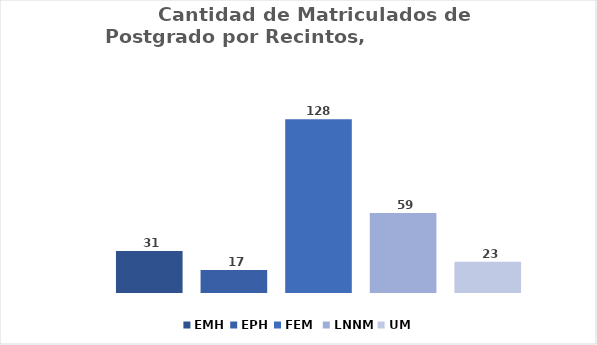
| Category | EMH | EPH | FEM  | LNNM | UM |
|---|---|---|---|---|---|
| Total  | 31 | 17 | 128 | 59 | 23 |